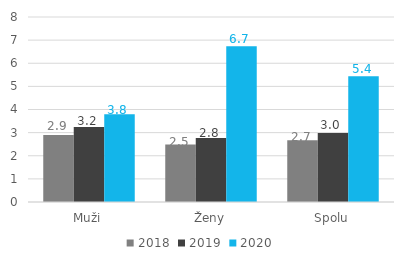
| Category | 2018 | 2019 | 2020 |
|---|---|---|---|
| 0 | 2.895 | 3.246 | 3.799 |
| 1 | 2.486 | 2.772 | 6.74 |
| 2 | 2.669 | 2.985 | 5.44 |